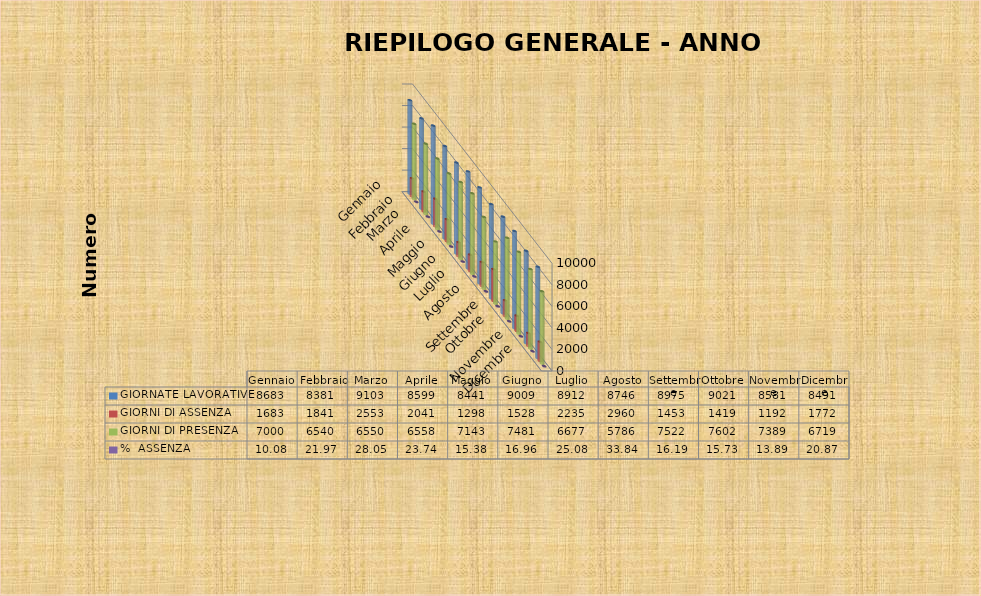
| Category | GIORNATE LAVORATIVE | GIORNI DI ASSENZA | GIORNI DI PRESENZA | %  ASSENZA |
|---|---|---|---|---|
| Gennaio | 8683 | 1683 | 7000 | 10.08 |
| Febbraio | 8381 | 1841 | 6540 | 21.966 |
| Marzo | 9103 | 2553 | 6550 | 28.046 |
| Aprile | 8599 | 2041 | 6558 | 23.735 |
| Maggio | 8441 | 1298 | 7143 | 15.377 |
| Giugno | 9009 | 1528 | 7481 | 16.961 |
| Luglio | 8912 | 2235 | 6677 | 25.079 |
| Agosto | 8746 | 2960 | 5786 | 33.844 |
| Settembre | 8975 | 1453 | 7522 | 16.189 |
| Ottobre | 9021 | 1419 | 7602 | 15.73 |
| Novembre | 8581 | 1192 | 7389 | 13.891 |
| Dicembre | 8491 | 1772 | 6719 | 20.869 |